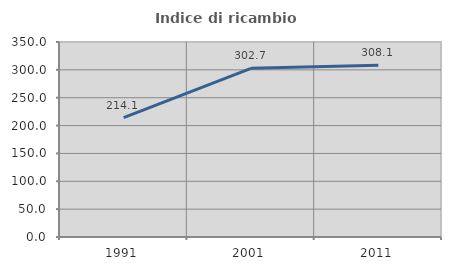
| Category | Indice di ricambio occupazionale  |
|---|---|
| 1991.0 | 214.094 |
| 2001.0 | 302.679 |
| 2011.0 | 308.13 |